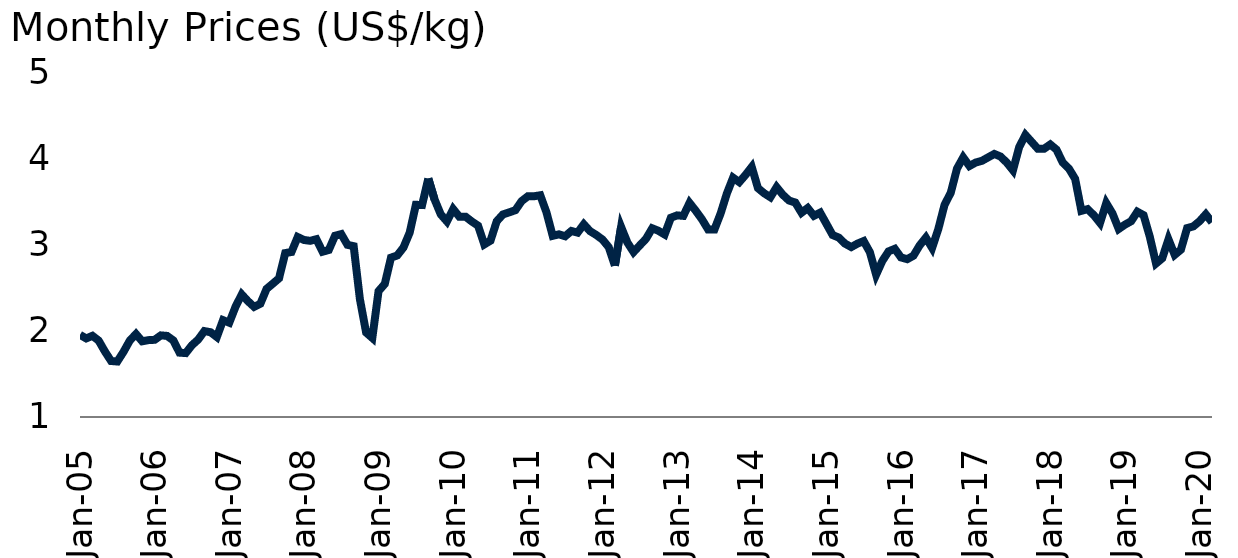
| Category | Series 0 |
|---|---|
| 2005-01-01 | 1.953 |
| 2005-02-01 | 1.911 |
| 2005-03-01 | 1.941 |
| 2005-04-01 | 1.886 |
| 2005-05-01 | 1.76 |
| 2005-06-01 | 1.649 |
| 2005-07-01 | 1.643 |
| 2005-08-01 | 1.756 |
| 2005-09-01 | 1.885 |
| 2005-10-01 | 1.962 |
| 2005-11-01 | 1.878 |
| 2005-12-01 | 1.891 |
| 2006-01-01 | 1.895 |
| 2006-02-01 | 1.946 |
| 2006-03-01 | 1.94 |
| 2006-04-01 | 1.888 |
| 2006-05-01 | 1.746 |
| 2006-06-01 | 1.741 |
| 2006-07-01 | 1.833 |
| 2006-08-01 | 1.898 |
| 2006-09-01 | 1.996 |
| 2006-10-01 | 1.983 |
| 2006-11-01 | 1.928 |
| 2006-12-01 | 2.123 |
| 2007-01-01 | 2.093 |
| 2007-02-01 | 2.278 |
| 2007-03-01 | 2.421 |
| 2007-04-01 | 2.343 |
| 2007-05-01 | 2.277 |
| 2007-06-01 | 2.313 |
| 2007-07-01 | 2.486 |
| 2007-08-01 | 2.546 |
| 2007-09-01 | 2.608 |
| 2007-10-01 | 2.901 |
| 2007-11-01 | 2.913 |
| 2007-12-01 | 3.087 |
| 2008-01-01 | 3.053 |
| 2008-02-01 | 3.043 |
| 2008-03-01 | 3.061 |
| 2008-04-01 | 2.916 |
| 2008-05-01 | 2.937 |
| 2008-06-01 | 3.101 |
| 2008-07-01 | 3.12 |
| 2008-08-01 | 2.996 |
| 2008-09-01 | 2.98 |
| 2008-10-01 | 2.367 |
| 2008-11-01 | 1.98 |
| 2008-12-01 | 1.916 |
| 2009-01-01 | 2.459 |
| 2009-02-01 | 2.543 |
| 2009-03-01 | 2.847 |
| 2009-04-01 | 2.873 |
| 2009-05-01 | 2.965 |
| 2009-06-01 | 3.136 |
| 2009-07-01 | 3.46 |
| 2009-08-01 | 3.458 |
| 2009-09-01 | 3.764 |
| 2009-10-01 | 3.524 |
| 2009-11-01 | 3.35 |
| 2009-12-01 | 3.267 |
| 2010-01-01 | 3.411 |
| 2010-02-01 | 3.321 |
| 2010-03-01 | 3.322 |
| 2010-04-01 | 3.266 |
| 2010-05-01 | 3.219 |
| 2010-06-01 | 3.001 |
| 2010-07-01 | 3.045 |
| 2010-08-01 | 3.27 |
| 2010-09-01 | 3.349 |
| 2010-10-01 | 3.372 |
| 2010-11-01 | 3.398 |
| 2010-12-01 | 3.503 |
| 2011-01-01 | 3.559 |
| 2011-02-01 | 3.559 |
| 2011-03-01 | 3.571 |
| 2011-04-01 | 3.372 |
| 2011-05-01 | 3.1 |
| 2011-06-01 | 3.118 |
| 2011-07-01 | 3.096 |
| 2011-08-01 | 3.157 |
| 2011-09-01 | 3.138 |
| 2011-10-01 | 3.234 |
| 2011-11-01 | 3.155 |
| 2011-12-01 | 3.111 |
| 2012-01-01 | 3.058 |
| 2012-02-01 | 2.97 |
| 2012-03-01 | 2.754 |
| 2012-04-01 | 3.204 |
| 2012-05-01 | 3.024 |
| 2012-06-01 | 2.912 |
| 2012-07-01 | 2.99 |
| 2012-08-01 | 3.066 |
| 2012-09-01 | 3.188 |
| 2012-10-01 | 3.159 |
| 2012-11-01 | 3.116 |
| 2012-12-01 | 3.31 |
| 2013-01-01 | 3.338 |
| 2013-02-01 | 3.332 |
| 2013-03-01 | 3.483 |
| 2013-04-01 | 3.391 |
| 2013-05-01 | 3.292 |
| 2013-06-01 | 3.173 |
| 2013-07-01 | 3.173 |
| 2013-08-01 | 3.36 |
| 2013-09-01 | 3.591 |
| 2013-10-01 | 3.775 |
| 2013-11-01 | 3.723 |
| 2013-12-01 | 3.807 |
| 2014-01-01 | 3.899 |
| 2014-02-01 | 3.654 |
| 2014-03-01 | 3.594 |
| 2014-04-01 | 3.548 |
| 2014-05-01 | 3.665 |
| 2014-06-01 | 3.576 |
| 2014-07-01 | 3.51 |
| 2014-08-01 | 3.487 |
| 2014-09-01 | 3.368 |
| 2014-10-01 | 3.423 |
| 2014-11-01 | 3.333 |
| 2014-12-01 | 3.37 |
| 2015-01-01 | 3.24 |
| 2015-02-01 | 3.11 |
| 2015-03-01 | 3.08 |
| 2015-04-01 | 3.01 |
| 2015-05-01 | 2.97 |
| 2015-06-01 | 3.01 |
| 2015-07-01 | 3.04 |
| 2015-08-01 | 2.91 |
| 2015-09-01 | 2.65 |
| 2015-10-01 | 2.81 |
| 2015-11-01 | 2.92 |
| 2015-12-01 | 2.95 |
| 2016-01-01 | 2.85 |
| 2016-02-01 | 2.83 |
| 2016-03-01 | 2.87 |
| 2016-04-01 | 2.99 |
| 2016-05-01 | 3.08 |
| 2016-06-01 | 2.96 |
| 2016-07-01 | 3.18 |
| 2016-08-01 | 3.46 |
| 2016-09-01 | 3.6 |
| 2016-10-01 | 3.88 |
| 2016-11-01 | 4.01 |
| 2016-12-01 | 3.91 |
| 2017-01-01 | 3.95 |
| 2017-02-01 | 3.97 |
| 2017-03-01 | 4.01 |
| 2017-04-01 | 4.05 |
| 2017-05-01 | 4.02 |
| 2017-06-01 | 3.95 |
| 2017-07-01 | 3.86 |
| 2017-08-01 | 4.13 |
| 2017-09-01 | 4.27 |
| 2017-10-01 | 4.19 |
| 2017-11-01 | 4.11 |
| 2017-12-01 | 4.11 |
| 2018-01-01 | 4.16 |
| 2018-02-01 | 4.1 |
| 2018-03-01 | 3.95 |
| 2018-04-01 | 3.88 |
| 2018-05-01 | 3.76 |
| 2018-06-01 | 3.39 |
| 2018-07-01 | 3.41 |
| 2018-08-01 | 3.34 |
| 2018-09-01 | 3.25 |
| 2018-10-01 | 3.48 |
| 2018-11-01 | 3.36 |
| 2018-12-01 | 3.18 |
| 2019-01-01 | 3.23 |
| 2019-02-01 | 3.27 |
| 2019-03-01 | 3.38 |
| 2019-04-01 | 3.34 |
| 2019-05-01 | 3.09 |
| 2019-06-01 | 2.78 |
| 2019-07-01 | 2.84 |
| 2019-08-01 | 3.06 |
| 2019-09-01 | 2.88 |
| 2019-10-01 | 2.94 |
| 2019-11-01 | 3.19 |
| 2019-12-01 | 3.21 |
| 2020-01-01 | 3.27 |
| 2020-02-01 | 3.35 |
| 2020-03-01 | 3.258 |